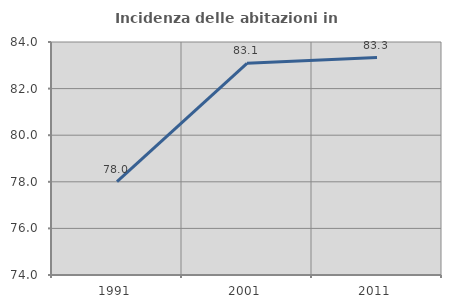
| Category | Incidenza delle abitazioni in proprietà  |
|---|---|
| 1991.0 | 78.007 |
| 2001.0 | 83.083 |
| 2011.0 | 83.333 |